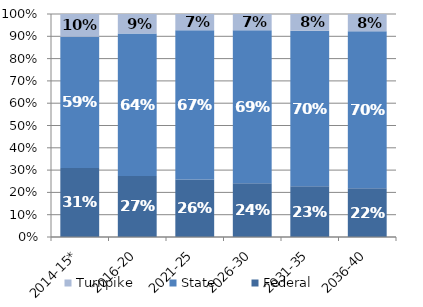
| Category | Federal | State | Turnpike |
|---|---|---|---|
| 2014-15* | 0.31 | 0.588 | 0.102 |
| 2016-20 | 0.274 | 0.639 | 0.087 |
| 2021-25 | 0.258 | 0.669 | 0.073 |
| 2026-30 | 0.241 | 0.686 | 0.073 |
| 2031-35 | 0.227 | 0.697 | 0.075 |
| 2036-40 | 0.219 | 0.704 | 0.077 |